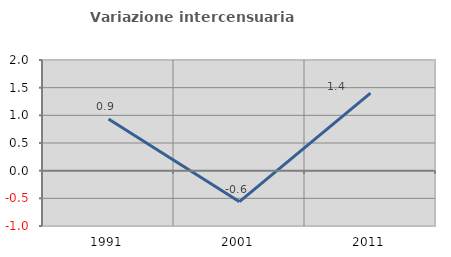
| Category | Variazione intercensuaria annua |
|---|---|
| 1991.0 | 0.935 |
| 2001.0 | -0.561 |
| 2011.0 | 1.402 |